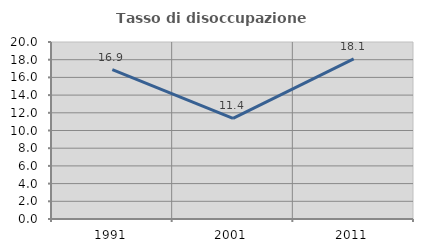
| Category | Tasso di disoccupazione giovanile  |
|---|---|
| 1991.0 | 16.889 |
| 2001.0 | 11.364 |
| 2011.0 | 18.095 |